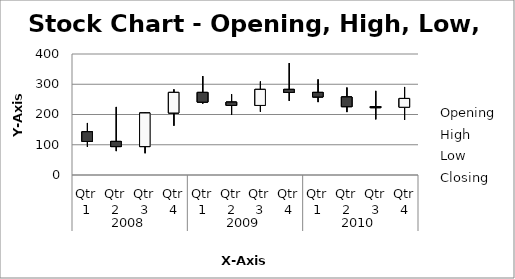
| Category | Opening | High | Low | Closing |
|---|---|---|---|---|
| 0 | 143 | 172 | 93 | 111 |
| 1 | 111 | 225 | 79 | 94 |
| 2 | 94 | 206 | 72 | 205 |
| 3 | 205 | 283 | 163 | 273 |
| 4 | 273 | 327 | 236 | 241 |
| 5 | 241 | 267 | 199 | 230 |
| 6 | 230 | 309 | 209 | 283 |
| 7 | 283 | 370 | 245 | 273 |
| 8 | 273 | 316 | 241 | 258 |
| 9 | 258 | 289 | 208 | 226 |
| 10 | 226 | 278 | 184 | 224 |
| 11 | 224 | 291 | 182 | 253 |